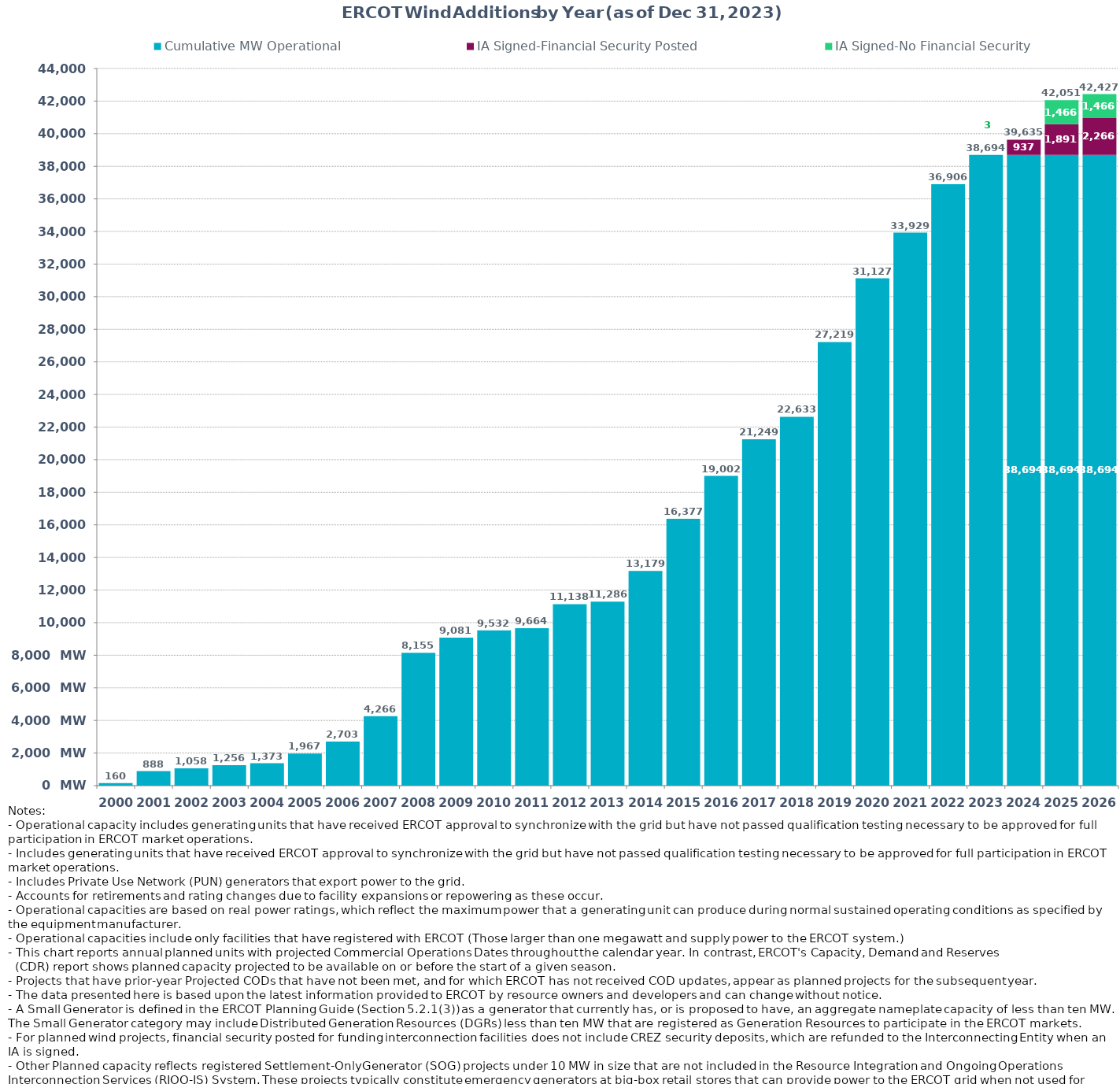
| Category | Cumulative MW Operational | IA Signed-Financial Security Posted  | IA Signed-No Financial Security  | Other Planned | Cumulative Installed and Planned |
|---|---|---|---|---|---|
| 2000.0 | 160.37 | 0 | 0 | 0 | 160.37 |
| 2001.0 | 887.97 | 0 | 0 | 0 | 887.97 |
| 2002.0 | 1058.22 | 0 | 0 | 0 | 1058.22 |
| 2003.0 | 1255.72 | 0 | 0 | 0 | 1255.72 |
| 2004.0 | 1372.82 | 0 | 0 | 0 | 1372.82 |
| 2005.0 | 1967.04 | 0 | 0 | 0 | 1967.04 |
| 2006.0 | 2703.34 | 0 | 0 | 0 | 2703.34 |
| 2007.0 | 4266.36 | 0 | 0 | 0 | 4266.36 |
| 2008.0 | 8154.76 | 0 | 0 | 0 | 8154.76 |
| 2009.0 | 9080.78 | 0 | 0 | 0 | 9080.78 |
| 2010.0 | 9531.7 | 0 | 0 | 0 | 9531.7 |
| 2011.0 | 9663.7 | 0 | 0 | 0 | 9663.7 |
| 2012.0 | 11137.66 | 0 | 0 | 0 | 11137.66 |
| 2013.0 | 11286.26 | 0 | 0 | 0 | 11286.26 |
| 2014.0 | 13178.84 | 0 | 0 | 0 | 13178.84 |
| 2015.0 | 16376.53 | 0 | 0 | 0 | 16376.53 |
| 2016.0 | 19001.85 | 0 | 0 | 0 | 19001.85 |
| 2017.0 | 21248.99 | 0 | 0 | 0 | 21248.99 |
| 2018.0 | 22632.69 | 0 | 0 | 0 | 22632.69 |
| 2019.0 | 27219.34 | 0 | 0 | 0 | 27219.34 |
| 2020.0 | 31127.31 | 0 | 0 | 0 | 31127.31 |
| 2021.0 | 33928.91 | 0 | 0 | 0 | 33928.91 |
| 2022.0 | 36906.07 | 0 | 0 | 0 | 36906.07 |
| 2023.0 | 38694.49 | 0 | 0 | 0 | 38694.49 |
| 2024.0 | 38694.49 | 937.37 | 3 | 0 | 39634.86 |
| 2025.0 | 38694.49 | 1890.75 | 1466.2 | 0 | 42051.44 |
| 2026.0 | 38694.49 | 2265.81 | 1466.2 | 0 | 42426.5 |